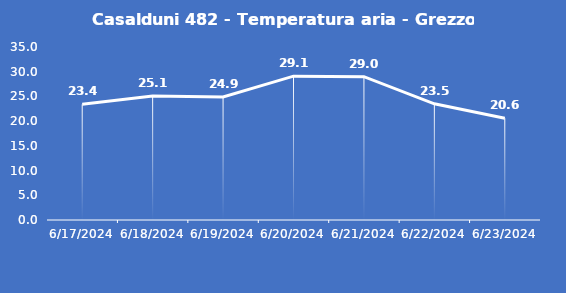
| Category | Casalduni 482 - Temperatura aria - Grezzo (°C) |
|---|---|
| 6/17/24 | 23.4 |
| 6/18/24 | 25.1 |
| 6/19/24 | 24.9 |
| 6/20/24 | 29.1 |
| 6/21/24 | 29 |
| 6/22/24 | 23.5 |
| 6/23/24 | 20.6 |